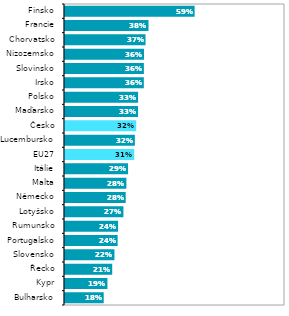
| Category | Series 1 |
|---|---|
| Bulharsko | 0.176 |
| Kypr | 0.193 |
| Řecko | 0.215 |
| Slovensko | 0.225 |
| Portugalsko | 0.239 |
| Rumunsko | 0.241 |
| Lotyšsko | 0.266 |
| Německo | 0.276 |
| Malta | 0.279 |
| Itálie | 0.287 |
| EU27 | 0.315 |
| Lucembursko | 0.318 |
| Česko | 0.324 |
| Maďarsko | 0.332 |
| Polsko | 0.332 |
| Irsko | 0.358 |
| Slovinsko | 0.359 |
| Nizozemsko | 0.359 |
| Chorvatsko | 0.366 |
| Francie | 0.38 |
| Finsko | 0.589 |